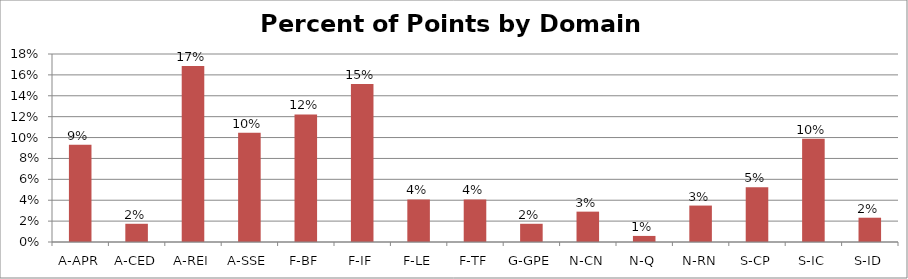
| Category | Percent |
|---|---|
| A-APR | 0.093 |
| A-CED | 0.017 |
| A-REI | 0.169 |
| A-SSE | 0.105 |
| F-BF | 0.122 |
| F-IF | 0.151 |
| F-LE | 0.041 |
| F-TF | 0.041 |
| G-GPE | 0.017 |
| N-CN | 0.029 |
| N-Q | 0.006 |
| N-RN | 0.035 |
| S-CP | 0.052 |
| S-IC | 0.099 |
| S-ID | 0.023 |